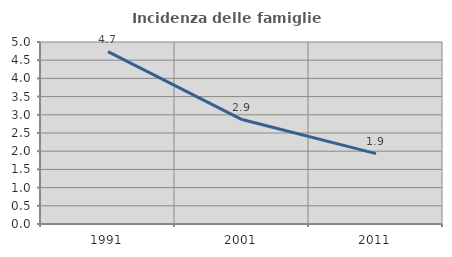
| Category | Incidenza delle famiglie numerose |
|---|---|
| 1991.0 | 4.735 |
| 2001.0 | 2.869 |
| 2011.0 | 1.933 |